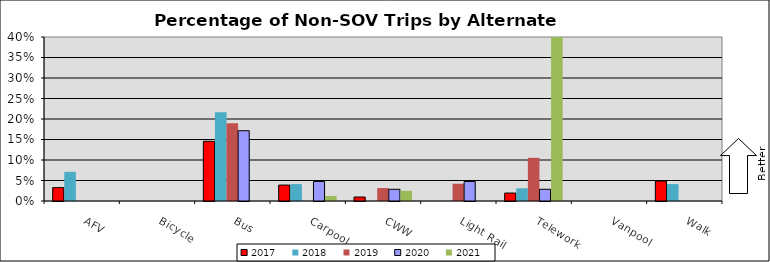
| Category | 2017 | 2018 | 2019 | 2020 | 2021 |
|---|---|---|---|---|---|
| AFV | 0.033 | 0.071 | 0 | 0 | 0 |
| Bicycle | 0 | 0 | 0 | 0 | 0 |
| Bus | 0.146 | 0.216 | 0.189 | 0.171 | 0 |
| Carpool | 0.039 | 0.041 | 0 | 0.048 | 0.012 |
| CWW | 0.01 | 0 | 0.032 | 0.029 | 0.025 |
| Light Rail | 0 | 0 | 0.042 | 0.048 | 0 |
| Telework | 0.019 | 0.031 | 0.105 | 0.029 | 0.728 |
| Vanpool | 0 | 0 | 0 | 0 | 0 |
| Walk | 0.049 | 0.041 | 0 | 0 | 0 |